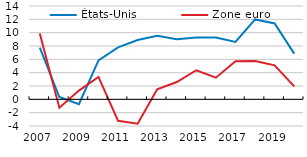
| Category | États-Unis | Zone euro |
|---|---|---|
| 2007.0 | 7.75 | 9.892 |
| 2008.0 | 0.35 | -1.253 |
| 2009.0 | -0.73 | 1.317 |
| 2010.0 | 5.85 | 3.356 |
| 2011.0 | 7.79 | -3.223 |
| 2012.0 | 8.9 | -3.667 |
| 2013.0 | 9.54 | 1.511 |
| 2014.0 | 9.01 | 2.598 |
| 2015.0 | 9.29 | 4.363 |
| 2016.0 | 9.27 | 3.243 |
| 2017.0 | 8.6 | 5.698 |
| 2018.0 | 11.98 | 5.761 |
| 2019.0 | 11.38 | 5.108 |
| 2020.0 | 6.85 | 1.937 |